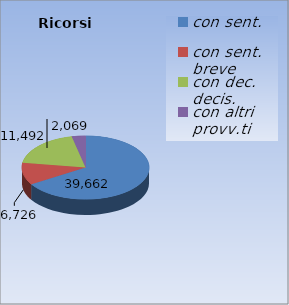
| Category | Ricorsi definiti |
|---|---|
| con sent. | 39662 |
| con sent. breve | 6726 |
| con dec. decis. | 11492 |
| con altri provv.ti | 2069 |